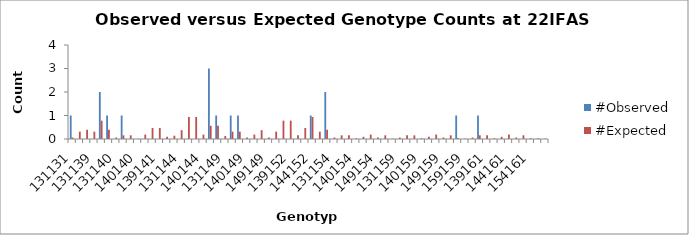
| Category | #Observed | #Expected |
|---|---|---|
| 131131.0 | 1 | 0.062 |
| 131137.0 | 0 | 0.312 |
| 137137.0 | 0 | 0.391 |
| 131139.0 | 0 | 0.312 |
| 137139.0 | 2 | 0.781 |
| 139139.0 | 1 | 0.391 |
| 131140.0 | 0 | 0.062 |
| 137140.0 | 1 | 0.156 |
| 139140.0 | 0 | 0.156 |
| 140140.0 | 0 | 0.016 |
| 131141.0 | 0 | 0.188 |
| 137141.0 | 0 | 0.469 |
| 139141.0 | 0 | 0.469 |
| 140141.0 | 0 | 0.094 |
| 141141.0 | 0 | 0.141 |
| 131144.0 | 0 | 0.375 |
| 137144.0 | 0 | 0.938 |
| 139144.0 | 0 | 0.938 |
| 140144.0 | 0 | 0.188 |
| 141144.0 | 3 | 0.562 |
| 144144.0 | 1 | 0.562 |
| 131149.0 | 0 | 0.125 |
| 137149.0 | 1 | 0.312 |
| 139149.0 | 1 | 0.312 |
| 140149.0 | 0 | 0.062 |
| 141149.0 | 0 | 0.188 |
| 144149.0 | 0 | 0.375 |
| 149149.0 | 0 | 0.062 |
| 131152.0 | 0 | 0.312 |
| 137152.0 | 0 | 0.781 |
| 139152.0 | 0 | 0.781 |
| 140152.0 | 0 | 0.156 |
| 141152.0 | 0 | 0.469 |
| 144152.0 | 1 | 0.938 |
| 149152.0 | 0 | 0.312 |
| 152152.0 | 2 | 0.391 |
| 131154.0 | 0 | 0.062 |
| 137154.0 | 0 | 0.156 |
| 139154.0 | 0 | 0.156 |
| 140154.0 | 0 | 0.031 |
| 141154.0 | 0 | 0.094 |
| 144154.0 | 0 | 0.188 |
| 149154.0 | 0 | 0.062 |
| 152154.0 | 0 | 0.156 |
| 154154.0 | 0 | 0.016 |
| 131159.0 | 0 | 0.062 |
| 137159.0 | 0 | 0.156 |
| 139159.0 | 0 | 0.156 |
| 140159.0 | 0 | 0.031 |
| 141159.0 | 0 | 0.094 |
| 144159.0 | 0 | 0.188 |
| 149159.0 | 0 | 0.062 |
| 152159.0 | 0 | 0.156 |
| 154159.0 | 1 | 0.031 |
| 159159.0 | 0 | 0.016 |
| 131161.0 | 0 | 0.062 |
| 137161.0 | 1 | 0.156 |
| 139161.0 | 0 | 0.156 |
| 140161.0 | 0 | 0.031 |
| 141161.0 | 0 | 0.094 |
| 144161.0 | 0 | 0.188 |
| 149161.0 | 0 | 0.062 |
| 152161.0 | 0 | 0.156 |
| 154161.0 | 0 | 0.031 |
| 159161.0 | 0 | 0.031 |
| 161161.0 | 0 | 0.016 |